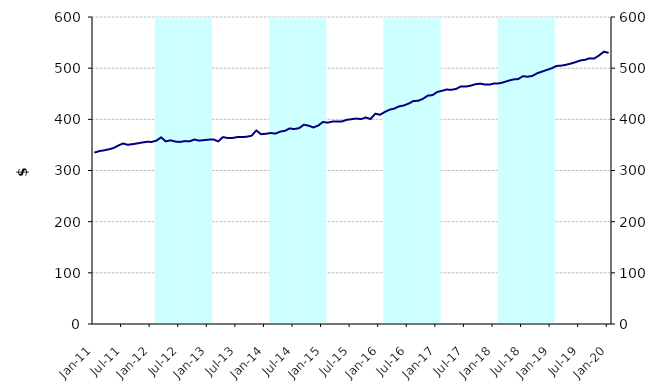
| Category | Series 1 |
|---|---|
| 0 | 0 |
| 1900-01-01 | 0 |
| 1900-01-02 | 0 |
| 1900-01-03 | 0 |
| 1900-01-04 | 0 |
| 1900-01-05 | 0 |
| 1900-01-06 | 0 |
| 1900-01-07 | 0 |
| 1900-01-08 | 0 |
| 1900-01-09 | 0 |
| 1900-01-10 | 0 |
| 1900-01-11 | 0 |
| 1900-01-12 | 0 |
| 1900-01-13 | 600000000 |
| 1900-01-14 | 600000000 |
| 1900-01-15 | 600000000 |
| 1900-01-16 | 600000000 |
| 1900-01-17 | 600000000 |
| 1900-01-18 | 600000000 |
| 1900-01-19 | 600000000 |
| 1900-01-20 | 600000000 |
| 1900-01-21 | 600000000 |
| 1900-01-22 | 600000000 |
| 1900-01-23 | 600000000 |
| 1900-01-24 | 600000000 |
| 1900-01-25 | 0 |
| 1900-01-26 | 0 |
| 1900-01-27 | 0 |
| 1900-01-28 | 0 |
| 1900-01-29 | 0 |
| 1900-01-30 | 0 |
| 1900-01-31 | 0 |
| 1900-02-01 | 0 |
| 1900-02-02 | 0 |
| 1900-02-03 | 0 |
| 1900-02-04 | 0 |
| 1900-02-05 | 0 |
| 1900-02-06 | 600000000 |
| 1900-02-07 | 600000000 |
| 1900-02-08 | 600000000 |
| 1900-02-09 | 600000000 |
| 1900-02-10 | 600000000 |
| 1900-02-11 | 600000000 |
| 1900-02-12 | 600000000 |
| 1900-02-13 | 600000000 |
| 1900-02-14 | 600000000 |
| 1900-02-15 | 600000000 |
| 1900-02-16 | 600000000 |
| 1900-02-17 | 600000000 |
| 1900-02-18 | 0 |
| 1900-02-19 | 0 |
| 1900-02-20 | 0 |
| 1900-02-21 | 0 |
| 1900-02-22 | 0 |
| 1900-02-23 | 0 |
| 1900-02-24 | 0 |
| 1900-02-25 | 0 |
| 1900-02-26 | 0 |
| 1900-02-27 | 0 |
| 1900-02-28 | 0 |
| 1900-02-28 | 0 |
| 1900-03-01 | 600000000 |
| 1900-03-02 | 600000000 |
| 1900-03-03 | 600000000 |
| 1900-03-04 | 600000000 |
| 1900-03-05 | 600000000 |
| 1900-03-06 | 600000000 |
| 1900-03-07 | 600000000 |
| 1900-03-08 | 600000000 |
| 1900-03-09 | 600000000 |
| 1900-03-10 | 600000000 |
| 1900-03-11 | 600000000 |
| 1900-03-12 | 600000000 |
| 1900-03-13 | 0 |
| 1900-03-14 | 0 |
| 1900-03-15 | 0 |
| 1900-03-16 | 0 |
| 1900-03-17 | 0 |
| 1900-03-18 | 0 |
| 1900-03-19 | 0 |
| 1900-03-20 | 0 |
| 1900-03-21 | 0 |
| 1900-03-22 | 0 |
| 1900-03-23 | 0 |
| 1900-03-24 | 0 |
| 1900-03-25 | 600000000 |
| 1900-03-26 | 600000000 |
| 1900-03-27 | 600000000 |
| 1900-03-28 | 600000000 |
| 1900-03-29 | 600000000 |
| 1900-03-30 | 600000000 |
| 1900-03-31 | 600000000 |
| 1900-04-01 | 600000000 |
| 1900-04-02 | 600000000 |
| 1900-04-03 | 600000000 |
| 1900-04-04 | 600000000 |
| 1900-04-05 | 600000000 |
| 1900-04-06 | 0 |
| 1900-04-07 | 0 |
| 1900-04-08 | 0 |
| 1900-04-09 | 0 |
| 1900-04-10 | 0 |
| 1900-04-11 | 0 |
| 1900-04-12 | 0 |
| 1900-04-13 | 0 |
| 1900-04-14 | 0 |
| 1900-04-15 | 0 |
| 1900-04-16 | 0 |
| 1900-04-17 | 0 |